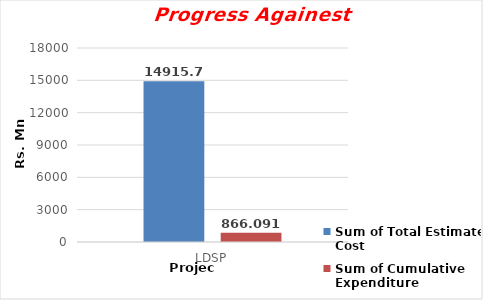
| Category | Sum of Total Estimate Cost | Sum of Cumulative Expenditure  |
|---|---|---|
| LDSP | 14915.71 | 866.091 |